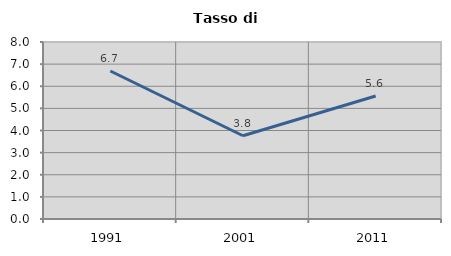
| Category | Tasso di disoccupazione   |
|---|---|
| 1991.0 | 6.69 |
| 2001.0 | 3.763 |
| 2011.0 | 5.56 |